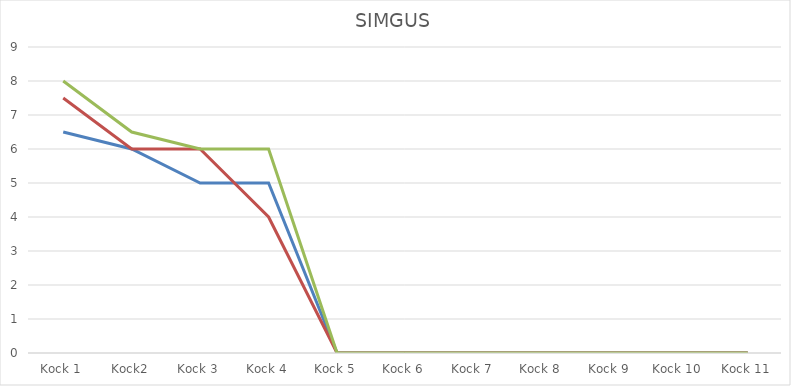
| Category | 26 - 30  = hög råvarukvalitet Utseende | 26 - 30  = hög råvarukvalitet Mörhet | 26 - 30  = hög råvarukvalitet Smak/doft |
|---|---|---|---|
| Kock 1 | 6.5 | 7.5 | 8 |
| Kock2 | 6 | 6 | 6.5 |
| Kock 3 | 5 | 6 | 6 |
| Kock 4 | 5 | 4 | 6 |
| Kock 5 | 0 | 0 | 0 |
| Kock 6 | 0 | 0 | 0 |
| Kock 7 | 0 | 0 | 0 |
| Kock 8 | 0 | 0 | 0 |
| Kock 9 | 0 | 0 | 0 |
| Kock 10 | 0 | 0 | 0 |
| Kock 11 | 0 | 0 | 0 |